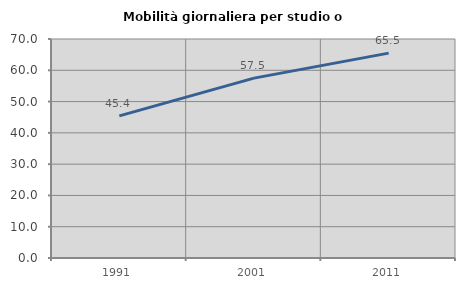
| Category | Mobilità giornaliera per studio o lavoro |
|---|---|
| 1991.0 | 45.432 |
| 2001.0 | 57.487 |
| 2011.0 | 65.482 |